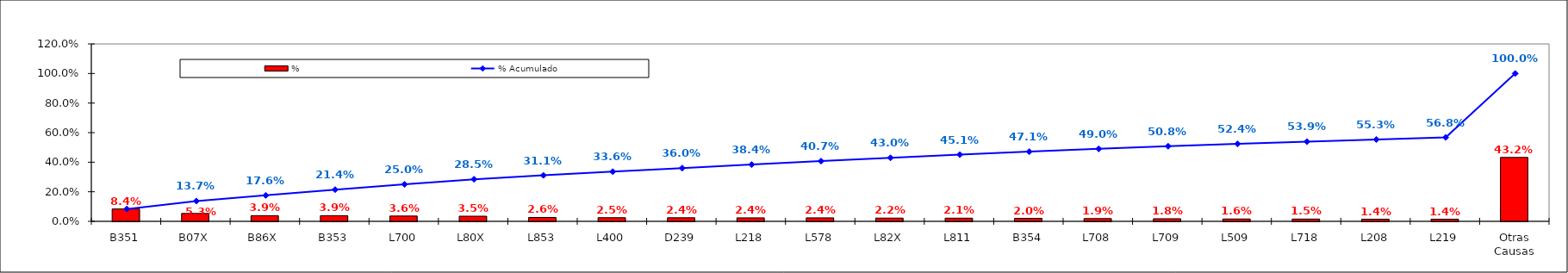
| Category | % |
|---|---|
| B351 | 0.084 |
| B07X | 0.053 |
| B86X | 0.039 |
| B353 | 0.039 |
| L700 | 0.036 |
| L80X | 0.035 |
| L853 | 0.026 |
| L400 | 0.025 |
| D239 | 0.024 |
| L218 | 0.024 |
| L578 | 0.024 |
| L82X | 0.022 |
| L811 | 0.021 |
| B354 | 0.02 |
| L708 | 0.019 |
| L709 | 0.018 |
| L509 | 0.016 |
| L718 | 0.015 |
| L208 | 0.014 |
| L219 | 0.014 |
| Otras Causas | 0.432 |